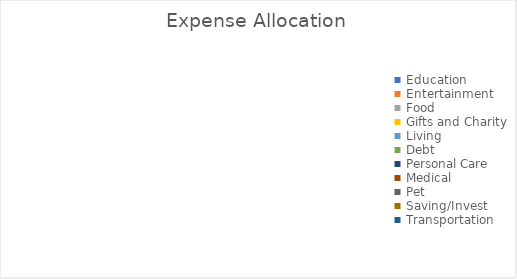
| Category | Series 0 |
|---|---|
| Education | 0 |
| Entertainment | 0 |
| Food | 0 |
| Gifts and Charity | 0 |
| Living | 0 |
| Debt | 0 |
| Personal Care | 0 |
| Medical | 0 |
| Pet | 0 |
| Saving/Invest | 0 |
| Transportation | 0 |